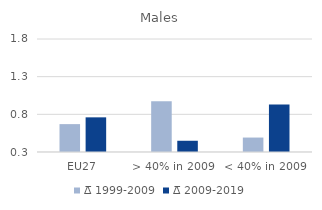
| Category | ∆̅ 1999-2009 | ∆̅ 2009-2019 |
|---|---|---|
| EU27 | 0.67 | 0.76 |
| > 40% in 2009 | 0.972 | 0.449 |
| < 40% in 2009 | 0.492 | 0.93 |